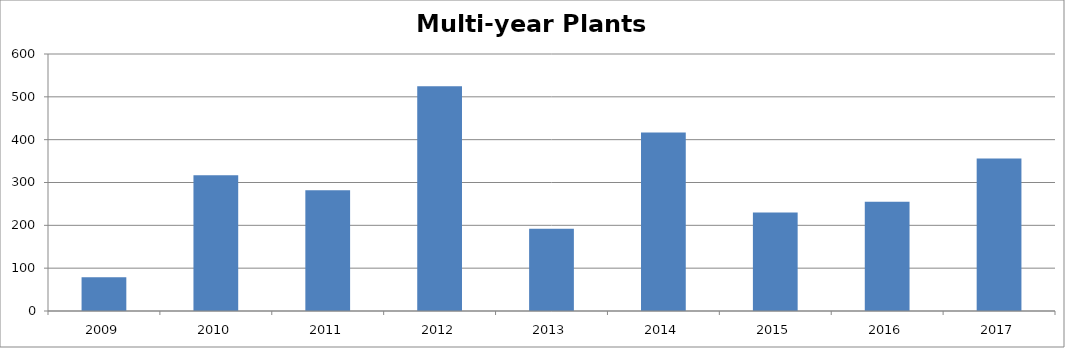
| Category | Multi-year Plants Observations |
|---|---|
| 2009.0 | 79 |
| 2010.0 | 317 |
| 2011.0 | 282 |
| 2012.0 | 525 |
| 2013.0 | 192 |
| 2014.0 | 417 |
| 2015.0 | 230 |
| 2016.0 | 255 |
| 2017.0 | 356 |